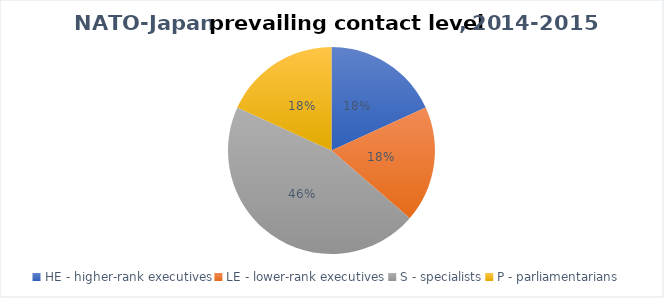
| Category | 2014-2015 |
|---|---|
| HE - higher-rank executives | 2 |
| LE - lower-rank executives | 2 |
| S - specialists | 5 |
| P - parliamentarians | 2 |